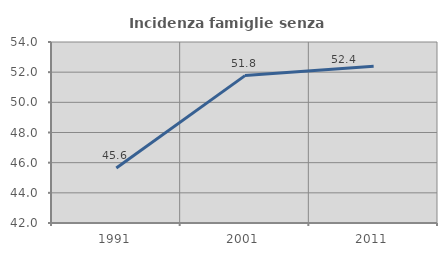
| Category | Incidenza famiglie senza nuclei |
|---|---|
| 1991.0 | 45.649 |
| 2001.0 | 51.772 |
| 2011.0 | 52.387 |